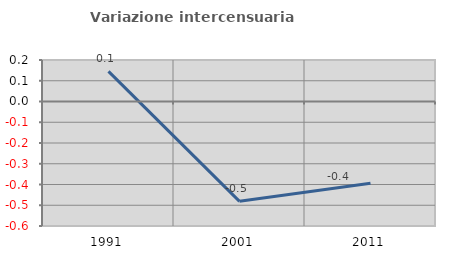
| Category | Variazione intercensuaria annua |
|---|---|
| 1991.0 | 0.145 |
| 2001.0 | -0.481 |
| 2011.0 | -0.394 |